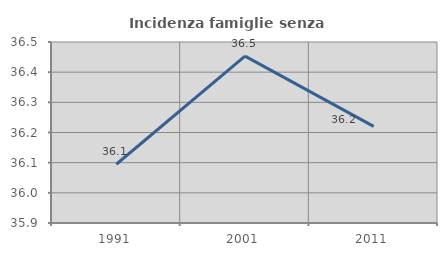
| Category | Incidenza famiglie senza nuclei |
|---|---|
| 1991.0 | 36.095 |
| 2001.0 | 36.453 |
| 2011.0 | 36.22 |